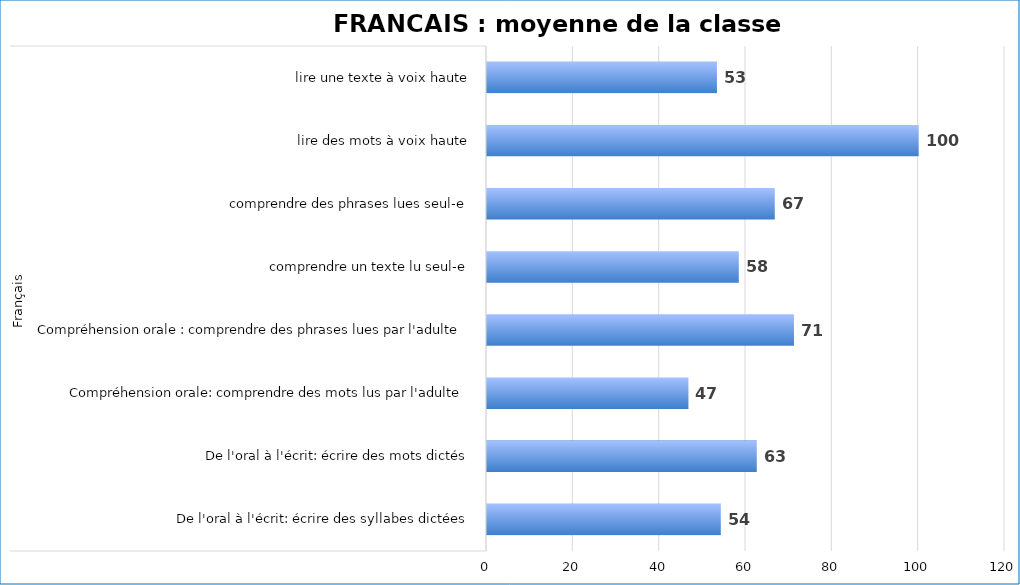
| Category | Series 0 |
|---|---|
| 0 | 54.167 |
| 1 | 62.5 |
| 2 | 46.667 |
| 3 | 71.111 |
| 4 | 58.333 |
| 5 | 66.667 |
| 6 | 100 |
| 7 | 53.268 |